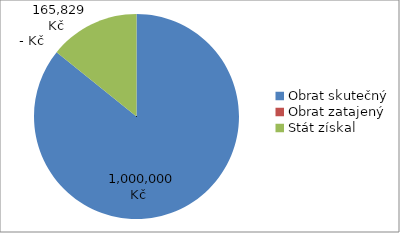
| Category | Series 1 | Series 0 |
|---|---|---|
| Obrat skutečný | 1000000 | 1000000 |
| Obrat zatajený | 0 | 0 |
| Stát získal | 165829.28 | 165829.28 |